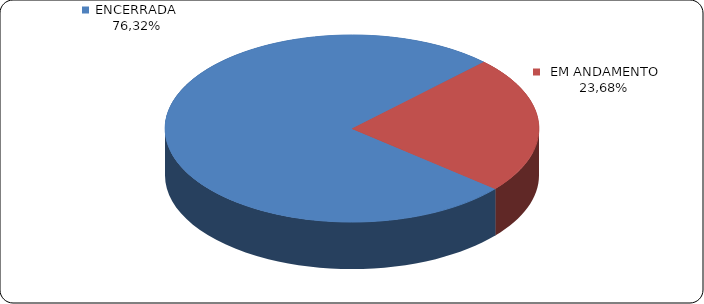
| Category | Series 0 |
|---|---|
|      ENCERRADA | 0.763 |
|      EM ANDAMENTO | 0.237 |